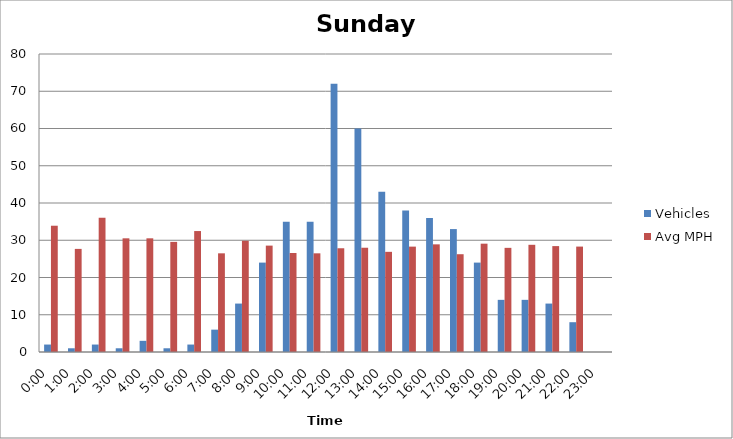
| Category | Vehicles | Avg MPH |
|---|---|---|
| 0:00 | 2 | 33.9 |
| 1:00 | 1 | 27.68 |
| 2:00 | 2 | 36.05 |
| 3:00 | 1 | 30.52 |
| 4:00 | 3 | 30.52 |
| 5:00 | 1 | 29.56 |
| 6:00 | 2 | 32.47 |
| 7:00 | 6 | 26.49 |
| 8:00 | 13 | 29.86 |
| 9:00 | 24 | 28.56 |
| 10:00 | 35 | 26.58 |
| 11:00 | 35 | 26.49 |
| 12:00 | 72 | 27.85 |
| 13:00 | 60 | 27.99 |
| 14:00 | 43 | 26.89 |
| 15:00 | 38 | 28.29 |
| 16:00 | 36 | 28.9 |
| 17:00 | 33 | 26.25 |
| 18:00 | 24 | 29.08 |
| 19:00 | 14 | 27.96 |
| 20:00 | 14 | 28.78 |
| 21:00 | 13 | 28.43 |
| 22:00 | 8 | 28.3 |
| 23:00 | 0 | 0 |